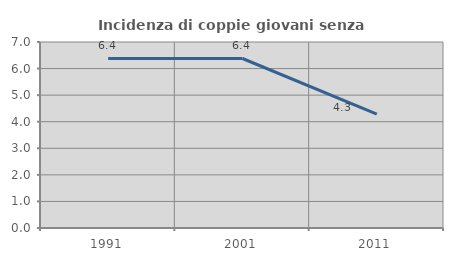
| Category | Incidenza di coppie giovani senza figli |
|---|---|
| 1991.0 | 6.381 |
| 2001.0 | 6.379 |
| 2011.0 | 4.285 |